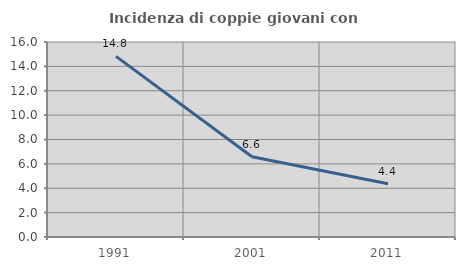
| Category | Incidenza di coppie giovani con figli |
|---|---|
| 1991.0 | 14.82 |
| 2001.0 | 6.58 |
| 2011.0 | 4.373 |